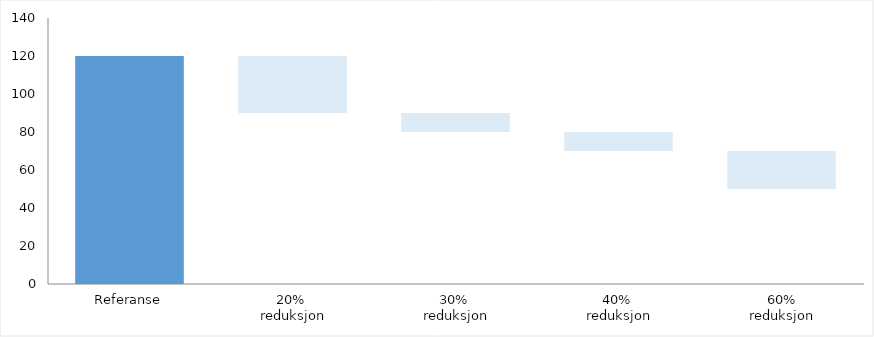
| Category | A1-A3 | A4 | A5 (kapp og svinn) | B2, B4 |
|---|---|---|---|---|
| 21 Grunn og fundamenter | 0 | 0 | 0 | 0 |
| 22 Bæresystemer | 0 | 0 | 0 | 0 |
| 23 Yttervegger | 0 | 0 | 0 | 0 |
| 24 Innervegger | 0 | 0 | 0 | 0 |
| 25 Dekker | 0 | 0 | 0 | 0 |
| 26 Yttertak | 0 | 0 | 0 | 0 |
| 28 Trapper og balkonger | 0 | 0 | 0 | 0 |